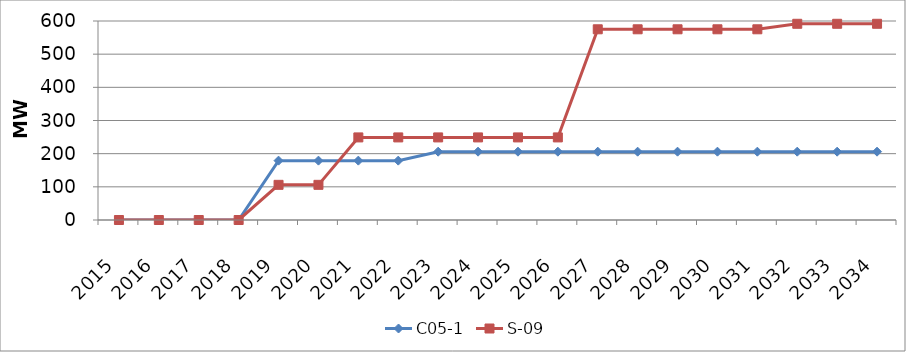
| Category | C05-1 | S-09 |
|---|---|---|
| 2015.0 | 0 | 0 |
| 2016.0 | 0 | 0 |
| 2017.0 | 0 | 0 |
| 2018.0 | 0 | 0 |
| 2019.0 | 179 | 106 |
| 2020.0 | 179 | 106 |
| 2021.0 | 179 | 249 |
| 2022.0 | 179 | 249 |
| 2023.0 | 206 | 249 |
| 2024.0 | 206 | 249 |
| 2025.0 | 206 | 249 |
| 2026.0 | 206 | 249 |
| 2027.0 | 206 | 575 |
| 2028.0 | 206 | 575 |
| 2029.0 | 206 | 575 |
| 2030.0 | 206 | 575 |
| 2031.0 | 206 | 575 |
| 2032.0 | 206 | 591.6 |
| 2033.0 | 206 | 591.6 |
| 2034.0 | 206 | 591.6 |